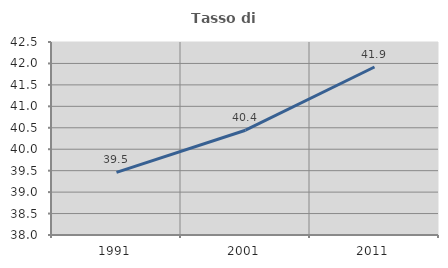
| Category | Tasso di occupazione   |
|---|---|
| 1991.0 | 39.46 |
| 2001.0 | 40.443 |
| 2011.0 | 41.918 |